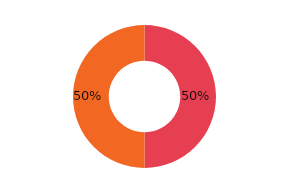
| Category | PASIVE |
|---|---|
| Banci | 5 |
| Alte instituții | 5 |